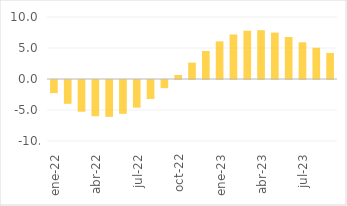
| Category | Total |
|---|---|
| ene-22 | -2.117 |
| feb-22 | -3.84 |
| mar-22 | -5.115 |
| abr-22 | -5.839 |
| may-22 | -5.945 |
| jun-22 | -5.456 |
| jul-22 | -4.461 |
| ago-22 | -3.056 |
| sep-22 | -1.317 |
| oct-22 | 0.642 |
| nov-22 | 2.641 |
| dic-22 | 4.515 |
| ene-23 | 6.071 |
| feb-23 | 7.181 |
| mar-23 | 7.787 |
| abr-23 | 7.871 |
| may-23 | 7.48 |
| jun-23 | 6.773 |
| jul-23 | 5.921 |
| ago-23 | 5.044 |
| sep-23 | 4.204 |